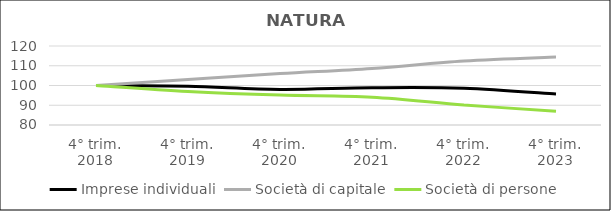
| Category | Imprese individuali | Società di capitale | Società di persone |
|---|---|---|---|
| 4° trim.
2018 | 100 | 100 | 100 |
| 4° trim.
2019 | 99.573 | 103.065 | 97.006 |
| 4° trim.
2020 | 98.035 | 106.033 | 95.134 |
| 4° trim.
2021 | 98.871 | 108.655 | 94.066 |
| 4° trim.
2022 | 98.631 | 112.396 | 90.182 |
| 4° trim.
2023 | 95.646 | 114.426 | 86.907 |